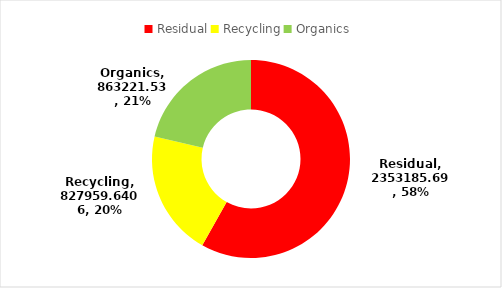
| Category | Series 0 |
|---|---|
| Residual | 2353185.69 |
| Recycling | 827959.641 |
| Organics | 863221.53 |